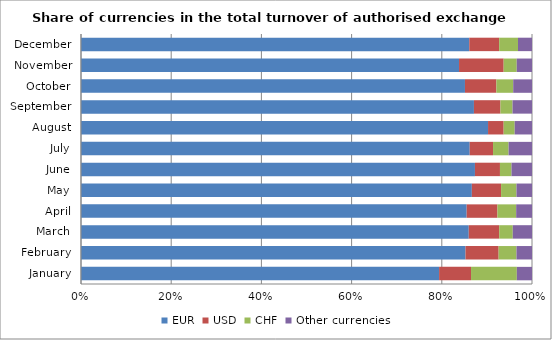
| Category | EUR | USD | CHF | Other currencies |
|---|---|---|---|---|
| January | 0.794 | 0.071 | 0.102 | 0.034 |
| February | 0.853 | 0.073 | 0.04 | 0.034 |
| March | 0.86 | 0.068 | 0.03 | 0.043 |
| April | 0.855 | 0.068 | 0.042 | 0.035 |
| May | 0.867 | 0.065 | 0.034 | 0.034 |
| June | 0.874 | 0.055 | 0.026 | 0.045 |
| July | 0.862 | 0.052 | 0.034 | 0.052 |
| August | 0.903 | 0.035 | 0.024 | 0.038 |
| September | 0.871 | 0.059 | 0.027 | 0.043 |
| October | 0.851 | 0.07 | 0.037 | 0.042 |
| November | 0.838 | 0.099 | 0.029 | 0.034 |
| December | 0.861 | 0.066 | 0.042 | 0.031 |